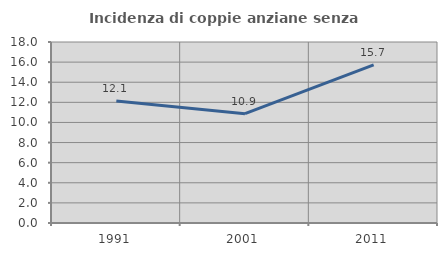
| Category | Incidenza di coppie anziane senza figli  |
|---|---|
| 1991.0 | 12.143 |
| 2001.0 | 10.87 |
| 2011.0 | 15.723 |